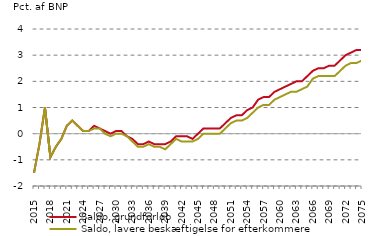
| Category | nul-linje | Saldo, grundforløb | Saldo, lavere beskæftigelse for efterkommere |
|---|---|---|---|
| 2015.0 | 0 | -1.5 | -1.5 |
| 2016.0 | 0 | -0.4 | -0.4 |
| 2017.0 | 0 | 1 | 1 |
| 2018.0 | 0 | -0.9 | -0.9 |
| 2019.0 | 0 | -0.5 | -0.5 |
| 2020.0 | 0 | -0.2 | -0.2 |
| 2021.0 | 0 | 0.3 | 0.3 |
| 2022.0 | 0 | 0.5 | 0.5 |
| 2023.0 | 0 | 0.3 | 0.3 |
| 2024.0 | 0 | 0.1 | 0.1 |
| 2025.0 | 0 | 0.1 | 0.1 |
| 2026.0 | 0 | 0.3 | 0.2 |
| 2027.0 | 0 | 0.2 | 0.2 |
| 2028.0 | 0 | 0.1 | 0 |
| 2029.0 | 0 | 0 | -0.1 |
| 2030.0 | 0 | 0.1 | 0 |
| 2031.0 | 0 | 0.1 | 0 |
| 2032.0 | 0 | -0.1 | -0.1 |
| 2033.0 | 0 | -0.2 | -0.3 |
| 2034.0 | 0 | -0.4 | -0.5 |
| 2035.0 | 0 | -0.4 | -0.5 |
| 2036.0 | 0 | -0.3 | -0.4 |
| 2037.0 | 0 | -0.4 | -0.5 |
| 2038.0 | 0 | -0.4 | -0.5 |
| 2039.0 | 0 | -0.4 | -0.6 |
| 2040.0 | 0 | -0.3 | -0.4 |
| 2041.0 | 0 | -0.1 | -0.2 |
| 2042.0 | 0 | -0.1 | -0.3 |
| 2043.0 | 0 | -0.1 | -0.3 |
| 2044.0 | 0 | -0.2 | -0.3 |
| 2045.0 | 0 | 0 | -0.2 |
| 2046.0 | 0 | 0.2 | 0 |
| 2047.0 | 0 | 0.2 | 0 |
| 2048.0 | 0 | 0.2 | 0 |
| 2049.0 | 0 | 0.2 | 0 |
| 2050.0 | 0 | 0.4 | 0.2 |
| 2051.0 | 0 | 0.6 | 0.4 |
| 2052.0 | 0 | 0.7 | 0.5 |
| 2053.0 | 0 | 0.7 | 0.5 |
| 2054.0 | 0 | 0.9 | 0.6 |
| 2055.0 | 0 | 1 | 0.8 |
| 2056.0 | 0 | 1.3 | 1 |
| 2057.0 | 0 | 1.4 | 1.1 |
| 2058.0 | 0 | 1.4 | 1.1 |
| 2059.0 | 0 | 1.6 | 1.3 |
| 2060.0 | 0 | 1.7 | 1.4 |
| 2061.0 | 0 | 1.8 | 1.5 |
| 2062.0 | 0 | 1.9 | 1.6 |
| 2063.0 | 0 | 2 | 1.6 |
| 2064.0 | 0 | 2 | 1.7 |
| 2065.0 | 0 | 2.2 | 1.8 |
| 2066.0 | 0 | 2.4 | 2.1 |
| 2067.0 | 0 | 2.5 | 2.2 |
| 2068.0 | 0 | 2.5 | 2.2 |
| 2069.0 | 0 | 2.6 | 2.2 |
| 2070.0 | 0 | 2.6 | 2.2 |
| 2071.0 | 0 | 2.8 | 2.4 |
| 2072.0 | 0 | 3 | 2.6 |
| 2073.0 | 0 | 3.1 | 2.7 |
| 2074.0 | 0 | 3.2 | 2.7 |
| 2075.0 | 0 | 3.2 | 2.8 |